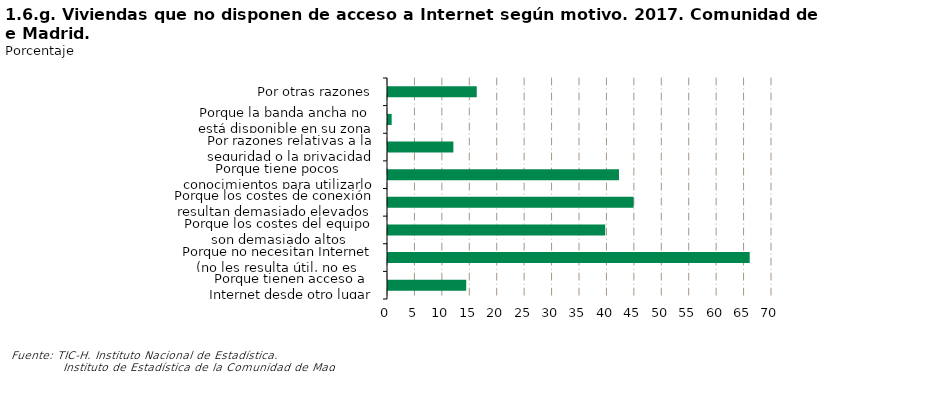
| Category | Series 0 |
|---|---|
| Porque tienen acceso a Internet desde otro lugar | 14.262 |
| Porque no necesitan Internet (no les resulta útil, no es interesante, etc.) | 65.938 |
| Porque los costes del equipo son demasiado altos | 39.593 |
| Porque los costes de conexión resultan demasiado elevados (teléfono, contrato de ADSL, etc.) | 44.774 |
| Porque tiene pocos conocimientos para utilizarlo | 42.105 |
| Por razones relativas a la seguridad o la privacidad | 11.916 |
| Porque la banda ancha no está disponible en su zona | 0.666 |
| Por otras razones | 16.178 |